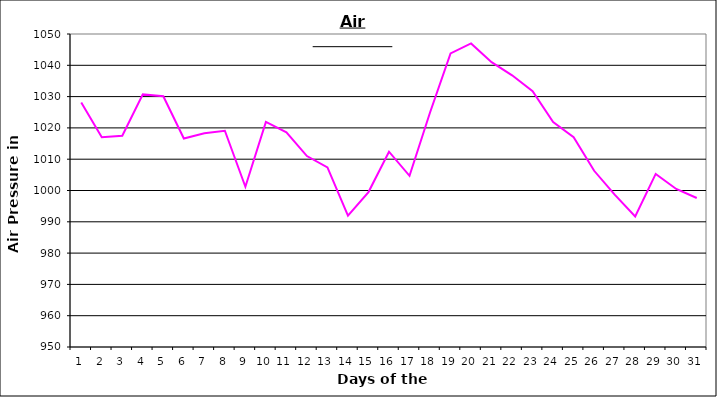
| Category | Series 0 |
|---|---|
| 0 | 1028.1 |
| 1 | 1017 |
| 2 | 1017.5 |
| 3 | 1030.7 |
| 4 | 1030.1 |
| 5 | 1016.6 |
| 6 | 1018.3 |
| 7 | 1019.1 |
| 8 | 1001.2 |
| 9 | 1021.9 |
| 10 | 1018.6 |
| 11 | 1011 |
| 12 | 1007.4 |
| 13 | 992 |
| 14 | 999.5 |
| 15 | 1012.4 |
| 16 | 1004.7 |
| 17 | 1024.9 |
| 18 | 1043.8 |
| 19 | 1047 |
| 20 | 1041 |
| 21 | 1036.8 |
| 22 | 1031.7 |
| 23 | 1021.9 |
| 24 | 1017 |
| 25 | 1006.3 |
| 26 | 998.7 |
| 27 | 991.7 |
| 28 | 1005.3 |
| 29 | 1000.5 |
| 30 | 997.6 |